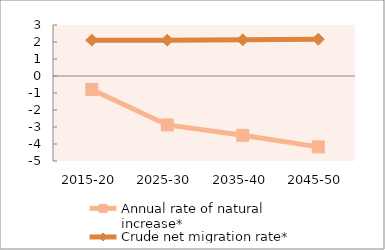
| Category | Annual rate of natural increase* | Crude net migration rate* |
|---|---|---|
| 2015-20 | -0.789 | 2.109 |
| 2025-30 | -2.877 | 2.105 |
| 2035-40 | -3.488 | 2.129 |
| 2045-50 | -4.17 | 2.164 |